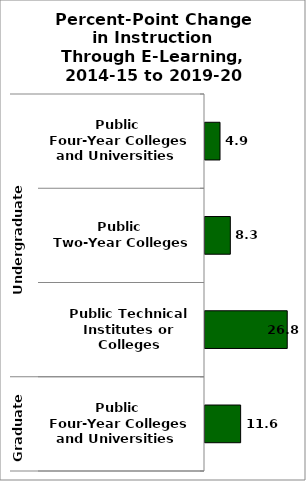
| Category | State |
|---|---|
| 0 | 4.899 |
| 1 | 8.261 |
| 2 | 26.82 |
| 3 | 11.621 |